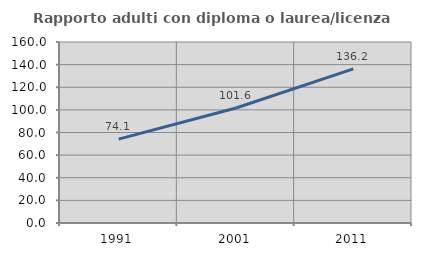
| Category | Rapporto adulti con diploma o laurea/licenza media  |
|---|---|
| 1991.0 | 74.108 |
| 2001.0 | 101.622 |
| 2011.0 | 136.215 |